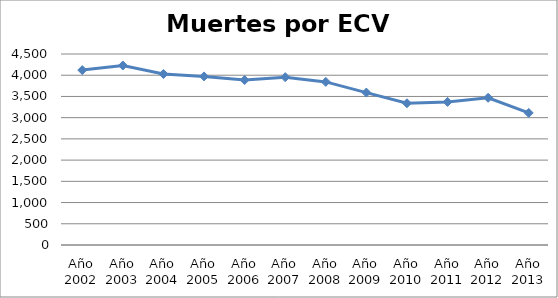
| Category | Series 0 |
|---|---|
| Año 2002 | 4121 |
| Año 2003 | 4229 |
| Año 2004 | 4029 |
| Año 2005 | 3972 |
| Año 2006 | 3887 |
| Año 2007 | 3954 |
| Año 2008 | 3843 |
| Año 2009 | 3591 |
| Año 2010 | 3339 |
| Año 2011 | 3371 |
| Año 2012 | 3468 |
| Año 2013 | 3112 |